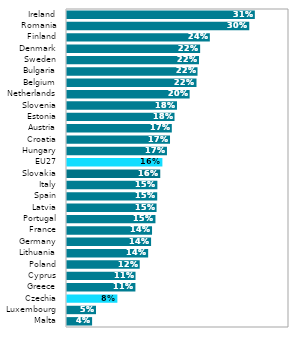
| Category | Series 0 |
|---|---|
| Malta | 0.042 |
| Luxembourg | 0.048 |
| Czechia | 0.084 |
| Greece | 0.114 |
| Cyprus | 0.114 |
| Poland | 0.121 |
| Lithuania | 0.135 |
| Germany | 0.14 |
| France | 0.142 |
| Portugal | 0.147 |
| Latvia | 0.149 |
| Spain | 0.15 |
| Italy | 0.151 |
| Slovakia | 0.155 |
| EU27 | 0.159 |
| Hungary | 0.167 |
| Croatia | 0.172 |
| Austria | 0.175 |
| Estonia | 0.179 |
| Slovenia | 0.183 |
| Netherlands | 0.204 |
| Belgium | 0.216 |
| Bulgaria | 0.218 |
| Sweden | 0.22 |
| Denmark | 0.222 |
| Finland | 0.238 |
| Romania | 0.304 |
| Ireland | 0.313 |